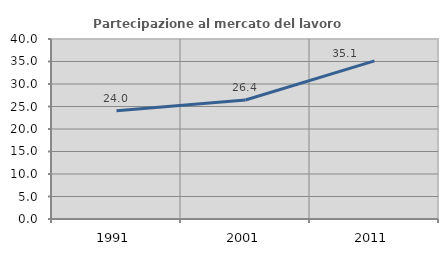
| Category | Partecipazione al mercato del lavoro  femminile |
|---|---|
| 1991.0 | 24.036 |
| 2001.0 | 26.444 |
| 2011.0 | 35.129 |